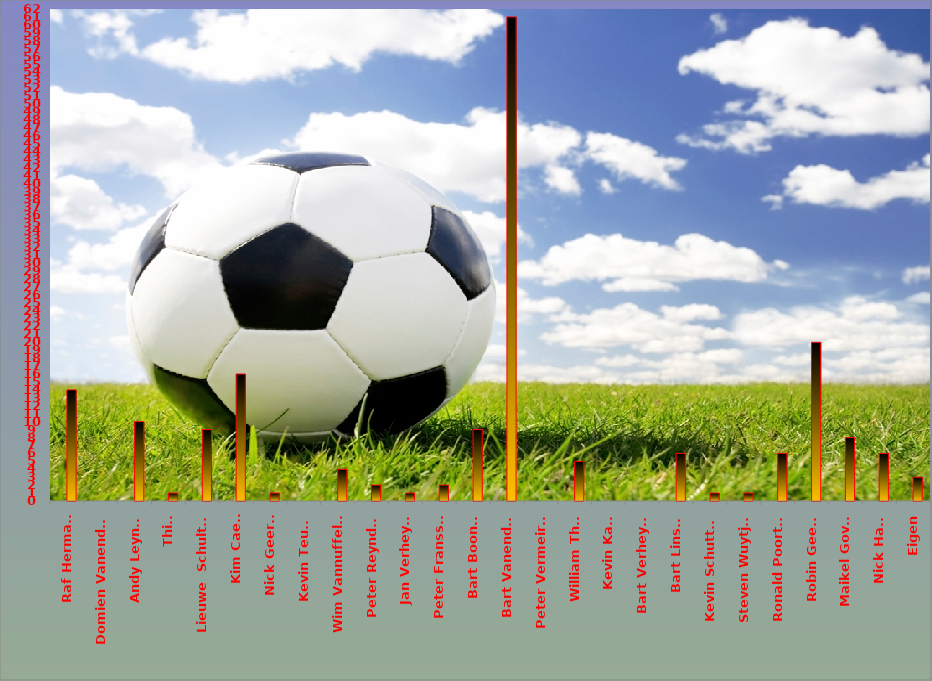
| Category | Series 0 | Series 1 |
|---|---|---|
| Raf Hermans |  | 14 |
| Domien Vanendert  |  | 0 |
| Andy Leynen |  | 10 |
| Thijs |  | 1 |
| Lieuwe  Schultink |  | 9 |
| Kim Caels |  | 16 |
| Nick Geerts |  | 1 |
| Kevin Teuwis |  | 0 |
| Wim Vannuffelen |  | 4 |
| Peter Reynders |  | 2 |
| Jan Verheyen |  | 1 |
| Peter Franssen |  | 2 |
| Bart Boonen |  | 9 |
| Bart Vanendert |  | 61 |
| Peter Vermeiren |  | 0 |
| William Thijs |  | 5 |
| Kevin Kalili |  | 0 |
| Bart Verheyen |  | 0 |
| Bart Linsen |  | 6 |
| Kevin Schutters |  | 1 |
| Steven Wuytjes |  | 1 |
| Ronald Poorters |  | 6 |
| Robin Geerts |  | 20 |
| Maikel Goven |  | 8 |
| Nick Haex |  | 6 |
| Eigen |  | 3 |